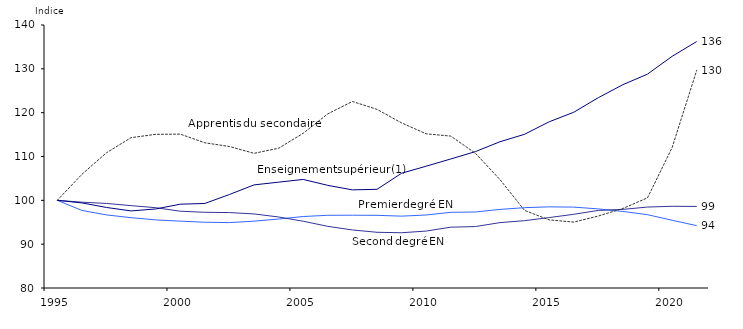
| Category | Premier degré EN | Second degré EN | Enseignement supérieur | Apprentis du secondaire |
|---|---|---|---|---|
| 1995.0 | 100 | 100 | 100 | 100 |
| 1996.0 | 97.701 | 99.577 | 99.411 | 105.937 |
| 1997.0 | 96.674 | 99.285 | 98.374 | 110.856 |
| 1998.0 | 96.047 | 98.792 | 97.583 | 114.296 |
| 1999.0 | 95.538 | 98.324 | 98.032 | 115.057 |
| 2000.0 | 95.251 | 97.518 | 99.12 | 115.106 |
| 2001.0 | 95.003 | 97.271 | 99.287 | 113.126 |
| 2002.0 | 94.919 | 97.206 | 101.33 | 112.282 |
| 2003.0 | 95.25 | 96.9 | 103.52 | 110.72 |
| 2004.0 | 95.737 | 96.2 | 104.146 | 111.891 |
| 2005.0 | 96.306 | 95.23 | 104.764 | 115.302 |
| 2006.0 | 96.59 | 94.065 | 103.414 | 119.735 |
| 2007.0 | 96.604 | 93.245 | 102.389 | 122.553 |
| 2008.0 | 96.582 | 92.711 | 102.511 | 120.754 |
| 2009.0 | 96.392 | 92.608 | 106.18 | 117.659 |
| 2010.0 | 96.655 | 92.987 | 107.79 | 115.175 |
| 2011.0 | 97.263 | 93.88 | 109.434 | 114.653 |
| 2012.0 | 97.339 | 94.013 | 111.11 | 110.748 |
| 2013.0 | 97.929 | 94.911 | 113.362 | 104.736 |
| 2014.0 | 98.328 | 95.362 | 115.067 | 97.702 |
| 2015.0 | 98.513 | 96.062 | 117.916 | 95.539 |
| 2016.0 | 98.454 | 96.812 | 120.092 | 95.034 |
| 2017.0 | 98.041 | 97.699 | 123.418 | 96.42 |
| 2018.0 | 97.465 | 97.935 | 126.39 | 98.148 |
| 2019.0 | 96.726 | 98.468 | 128.795 | 100.574 |
| 2020.0 | 95.452 | 98.643 | 132.855 | 112.04 |
| 2021.0 | 94.226 | 98.606 | 136.225 | 129.645 |